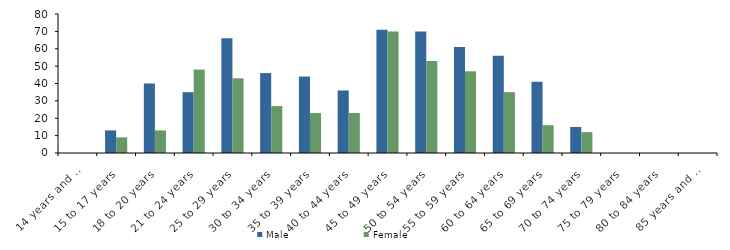
| Category | Male | Female |
|---|---|---|
| 14 years and under | 0 | 0 |
| 15 to 17 years | 13 | 9 |
| 18 to 20 years | 40 | 13 |
| 21 to 24 years | 35 | 48 |
| 25 to 29 years | 66 | 43 |
| 30 to 34 years | 46 | 27 |
| 35 to 39 years | 44 | 23 |
| 40 to 44 years | 36 | 23 |
| 45 to 49 years | 71 | 70 |
| 50 to 54 years | 70 | 53 |
| 55 to 59 years | 61 | 47 |
| 60 to 64 years | 56 | 35 |
| 65 to 69 years | 41 | 16 |
| 70 to 74 years | 15 | 12 |
| 75 to 79 years | 0 | 0 |
| 80 to 84 years | 0 | 0 |
| 85 years and over | 0 | 0 |